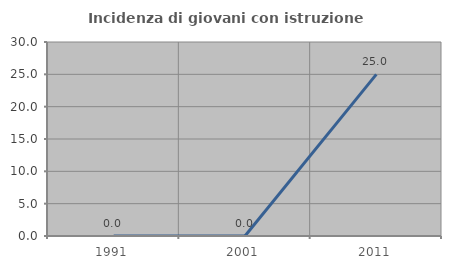
| Category | Incidenza di giovani con istruzione universitaria |
|---|---|
| 1991.0 | 0 |
| 2001.0 | 0 |
| 2011.0 | 25 |